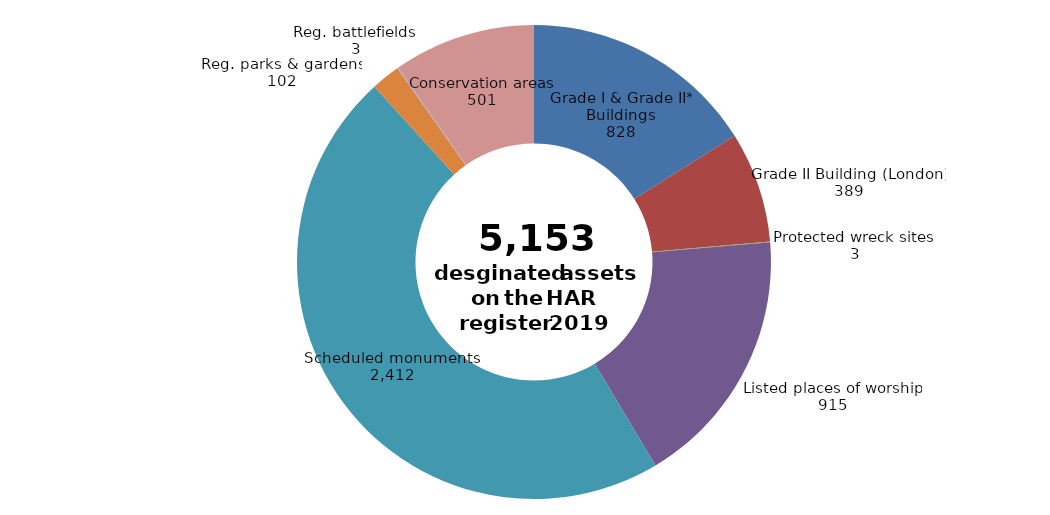
| Category | Number of designated assets on the HAR Register 2019 |
|---|---|
| Grade I & Grade II* Buildings | 828 |
| Grade II Building (London) | 389 |
| Protected wreck sites  | 3 |
| Listed places of worship | 915 |
| Scheduled monuments  | 2412 |
| Reg. parks & gardens | 102 |
| Reg. battlefields  | 3 |
| Conservation areas | 501 |